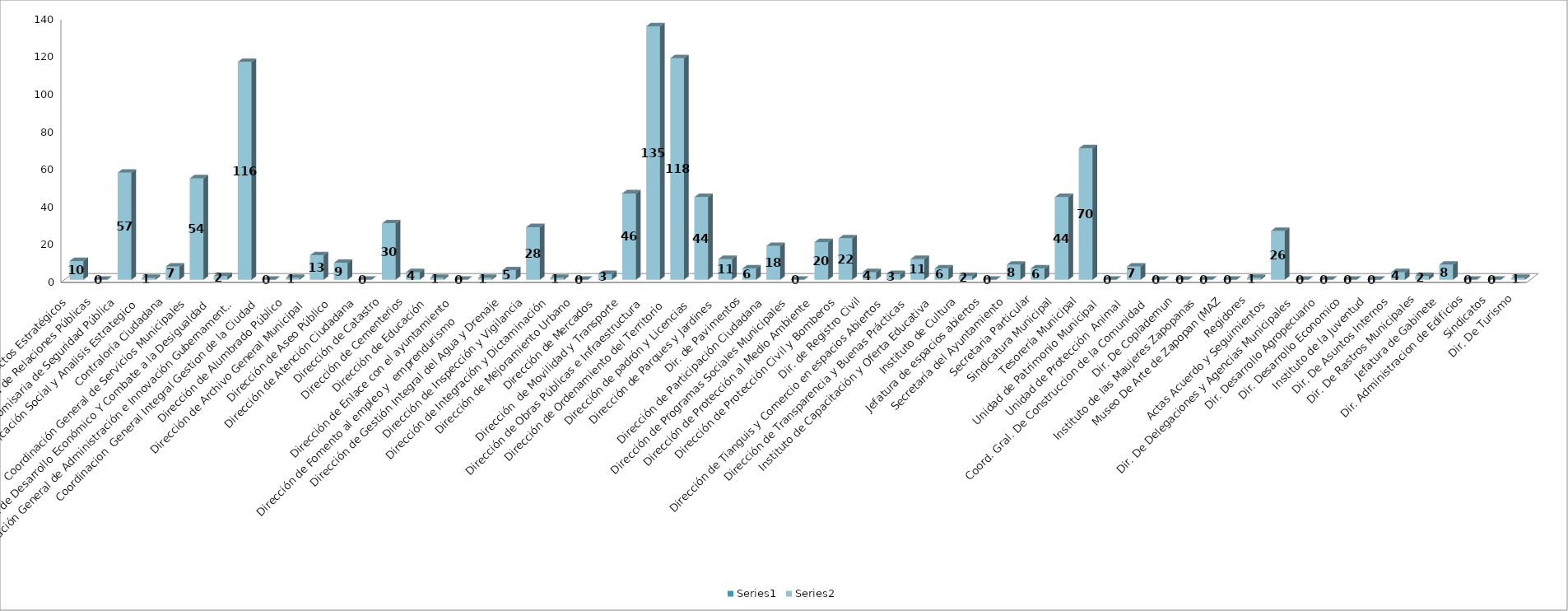
| Category | Series 0 | Series 1 |
|---|---|---|
| Area de Proyectos Estratégicos |  | 10 |
| Área de Relaciones Públicas |  | 0 |
| Comisaria de Seguridad Pública |  | 57 |
| Comunicación Social y Analisis Estrategico  |  | 1 |
| Contraloría Ciudadana |  | 7 |
| Coordinación General de Servicios Municipales |  | 54 |
| Coordinación de Desarrollo Económico Y Combate a la Desigualdad |  | 2 |
| Coordinación General de Administración e Innovación Gubernamental |  | 116 |
| Coordinacion  General Integral Gestion de la Ciudad |  | 0 |
| Dirección de Alumbrado Público |  | 1 |
| Dirección de Archivo General Municipal  |  | 13 |
| Dirección de Aseo Público  |  | 9 |
| Dirección de Atención Ciudadana |  | 0 |
| Dirección de Catastro |  | 30 |
| Dirección de Cementerios |  | 4 |
| Dirección de Educación  |  | 1 |
| Dirección de Enlace con el ayuntamiento |  | 0 |
| Dirección de Fomento al empleo y  emprendurismo         |  | 1 |
| Dirección de Gestión Integral del Agua y Drenaje |  | 5 |
| Dirección de Inspección y Vigilancia |  | 28 |
| Dirección de Integración y Dictaminación |  | 1 |
| Dirección de Mejoramiento Urbano |  | 0 |
| Dirección de Mercados  |  | 3 |
| Dirección  de Movilidad y Transporte |  | 46 |
| Dirección de Obras Públicas e Infraestructura |  | 135 |
| Dirección de Ordenamiento del Territorio  |  | 118 |
| Dirección de padrón y Licencias  |  | 44 |
| Dirección de Parques y Jardines  |  | 11 |
| Dir. de Pavimentos |  | 6 |
| Dirección de Participación Ciudadana |  | 18 |
| Dirección de Programas Sociales Municipales |  | 0 |
| Dirección de Protección al Medio Ambiente  |  | 20 |
| Dirección de Protección Civil y Bomberos |  | 22 |
| Dir. de Registro Civil |  | 4 |
| Dirección de Tianguis y Comercio en espacios Abiertos |  | 3 |
| Dirección de Transparencia y Buenas Prácticas |  | 11 |
| Instituto de Capacitación y Oferta Educativa |  | 6 |
| Instituto de Cultura  |  | 2 |
| Jefatura de espacios abiertos |  | 0 |
| Secretaría del Ayuntamiento |  | 8 |
| Secretaria Particular |  | 6 |
| Sindicatura Municipal |  | 44 |
| Tesorería Municipal |  | 70 |
| Unidad de Patrimonio Municipal  |  | 0 |
| Unidad de Protección  Animal  |  | 7 |
| Coord. Gral. De Construccion de la Comunidad |  | 0 |
| Dir. De Coplademun |  | 0 |
| Instituto de las Maujeres Zapopanas |  | 0 |
| Museo De Arte de Zapopan (MAZ |  | 0 |
| Regidores |  | 1 |
| Actas Acuerdo y Seguimientos  |  | 26 |
| Dir. De Delegaciones y Agencias Municipales |  | 0 |
|  Dir. Desarrollo Agropecuario |  | 0 |
| Dir. Desarrollo Economico |  | 0 |
| Instituto de la Juventud |  | 0 |
| Dir. De Asuntos Internos |  | 4 |
| Dir. De Rastros Municipales |  | 2 |
| Jefatura de Gabinete |  | 8 |
| Dir. Administracion de Edificios |  | 0 |
| Sindicatos |  | 0 |
| Dir. De Turismo |  | 1 |